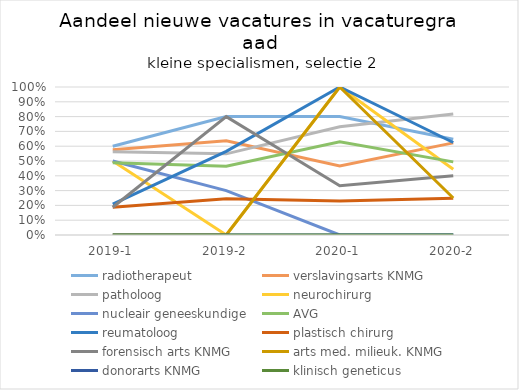
| Category | radiotherapeut | verslavingsarts KNMG | patholoog | neurochirurg | nucleair geneeskundige | AVG | reumatoloog | plastisch chirurg | forensisch arts KNMG | arts med. milieuk. KNMG | donorarts KNMG | klinisch geneticus |
|---|---|---|---|---|---|---|---|---|---|---|---|---|
| 2019-1 | 0.6 | 0.576 | 0.562 | 0.5 | 0.5 | 0.488 | 0.208 | 0.188 | 0.188 | 0 | 0 | 0 |
| 2019-2 | 0.8 | 0.636 | 0.548 | 0 | 0.3 | 0.464 | 0.565 | 0.244 | 0.8 | 0 | 0 | 0 |
| 2020-1 | 0.8 | 0.466 | 0.731 | 1 | 0 | 0.63 | 1 | 0.229 | 0.333 | 1 | 0 | 0 |
| 2020-2 | 0.647 | 0.622 | 0.818 | 0.444 | 0 | 0.494 | 0.625 | 0.248 | 0.4 | 0.25 | 0 | 0 |